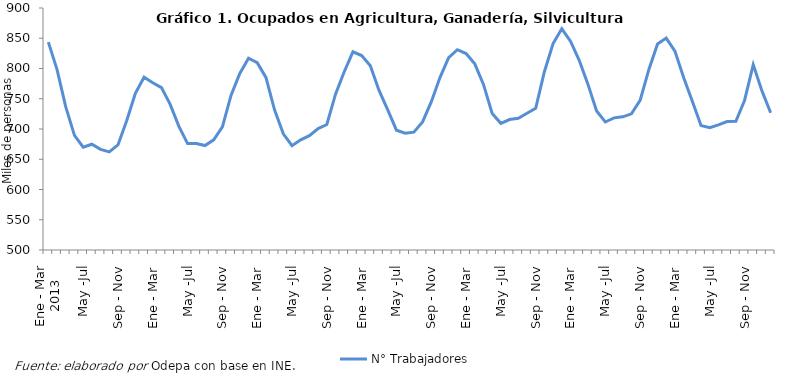
| Category | N° Trabajadores |
|---|---|
| 0 | 843.658 |
| 1 | 798.266 |
| 2 | 736.461 |
| 3 | 689.358 |
| 4 | 669.839 |
| 5 | 674.791 |
| 6 | 666.406 |
| 7 | 662.262 |
| 8 | 673.724 |
| 9 | 713.604 |
| 10 | 758.988 |
| 11 | 785.537 |
| 12 | 776.373 |
| 13 | 768.303 |
| 14 | 740.609 |
| 15 | 704.367 |
| 16 | 675.938 |
| 17 | 676.058 |
| 18 | 672.6 |
| 19 | 682.074 |
| 20 | 703.599 |
| 21 | 755.905 |
| 22 | 791.902 |
| 23 | 817.027 |
| 24 | 809.646 |
| 25 | 785.301 |
| 26 | 731.282 |
| 27 | 691.978 |
| 28 | 672.526 |
| 29 | 682.164 |
| 30 | 689.034 |
| 31 | 700.719 |
| 32 | 707.439 |
| 33 | 757.522 |
| 34 | 794.669 |
| 35 | 827.605 |
| 36 | 821.367 |
| 37 | 804.582 |
| 38 | 763.826 |
| 39 | 731.558 |
| 40 | 698.04 |
| 41 | 692.989 |
| 42 | 694.776 |
| 43 | 711.757 |
| 44 | 744.739 |
| 45 | 785.03 |
| 46 | 818.051 |
| 47 | 831.11 |
| 48 | 824.789 |
| 49 | 807.606 |
| 50 | 773.662 |
| 51 | 725.597 |
| 52 | 709.369 |
| 53 | 715.675 |
| 54 | 717.856 |
| 55 | 725.965 |
| 56 | 734.277 |
| 57 | 794.66 |
| 58 | 841.147 |
| 59 | 865.659 |
| 60 | 845.074 |
| 61 | 813.586 |
| 62 | 774.131 |
| 63 | 729.695 |
| 64 | 711.581 |
| 65 | 718.419 |
| 66 | 720.091 |
| 67 | 725.105 |
| 68 | 747.425 |
| 69 | 798.027 |
| 70 | 840.667 |
| 71 | 850.292 |
| 72 | 828.766 |
| 73 | 785.1 |
| 74 | 745.744 |
| 75 | 705.675 |
| 76 | 702.138 |
| 77 | 706.921 |
| 78 | 712.332 |
| 79 | 712.629 |
| 80 | 747.153 |
| 81 | 806.361 |
| 82 | 762.984 |
| 83 | 726.957 |